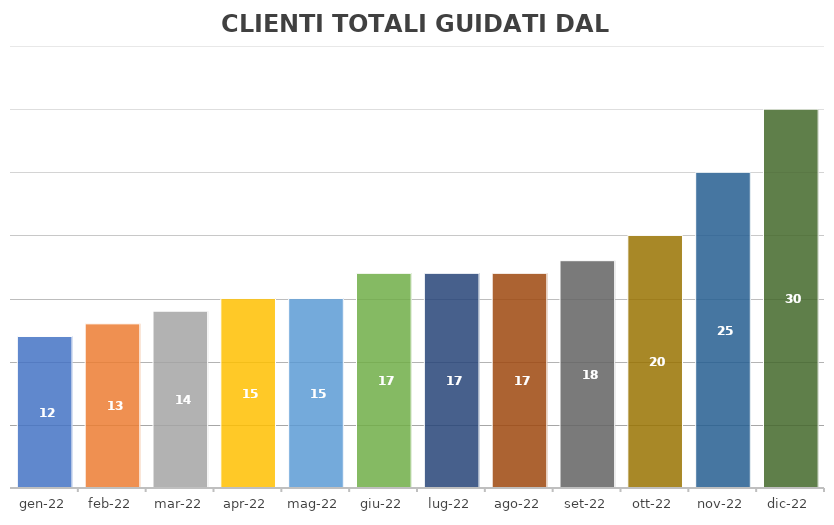
| Category | TOTALE |
|---|---|
| 2022-01-18 | 12 |
| 2022-02-18 | 13 |
| 2022-03-18 | 14 |
| 2022-04-18 | 15 |
| 2022-05-18 | 15 |
| 2022-06-18 | 17 |
| 2022-07-18 | 17 |
| 2022-08-18 | 17 |
| 2022-09-18 | 18 |
| 2022-10-18 | 20 |
| 2022-11-18 | 25 |
| 2022-12-18 | 30 |